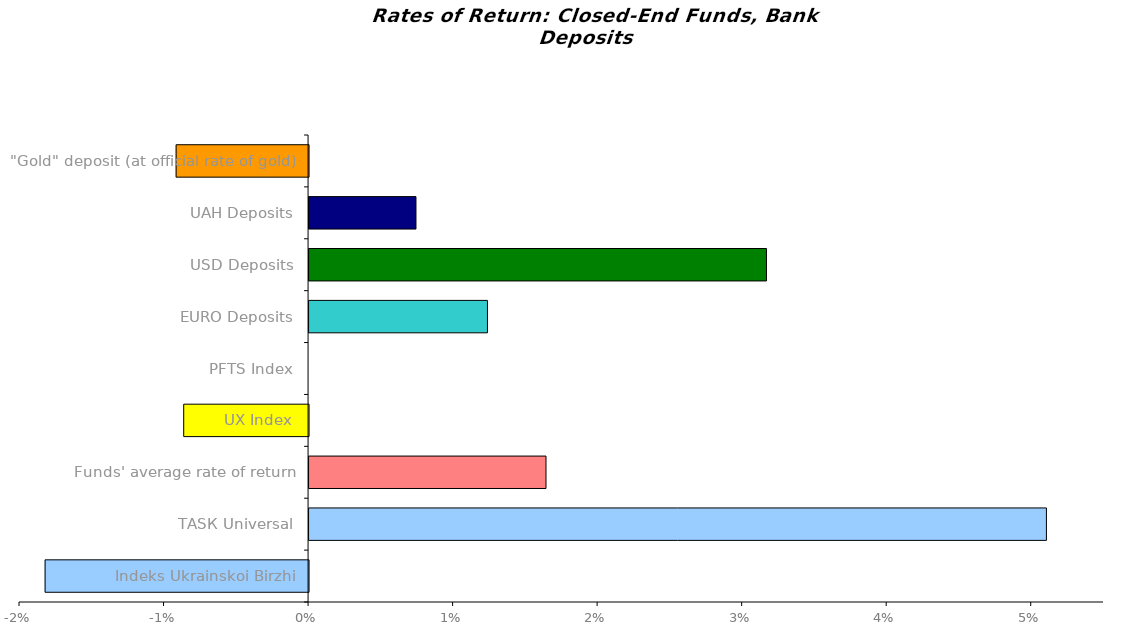
| Category | Series 0 |
|---|---|
| Іndeks Ukrainskoi Birzhi | -0.018 |
| ТАSК Universal | 0.051 |
| Funds' average rate of return | 0.016 |
| UX Index | -0.009 |
| PFTS Index | 0 |
| EURO Deposits | 0.012 |
| USD Deposits | 0.032 |
| UAH Deposits | 0.007 |
| "Gold" deposit (at official rate of gold) | -0.009 |